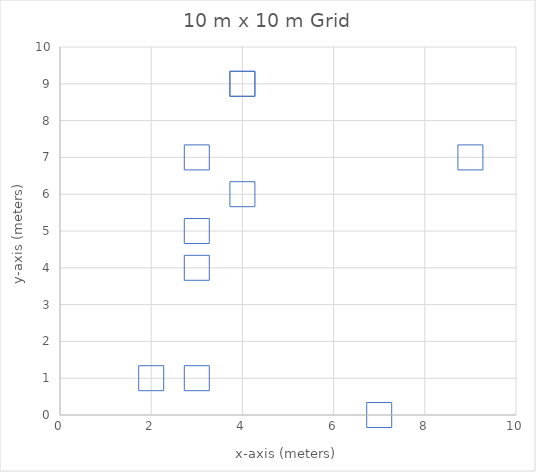
| Category | y |
|---|---|
| 9.0 | 7 |
| 4.0 | 6 |
| 3.0 | 1 |
| 3.0 | 4 |
| 7.0 | 0 |
| 4.0 | 9 |
| 4.0 | 9 |
| 3.0 | 7 |
| 2.0 | 1 |
| 3.0 | 5 |